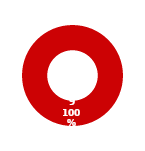
| Category | RESPONSE |
|---|---|
| MIL 1 Complete | 0 |
| MIL 1 Not Complete | 9 |